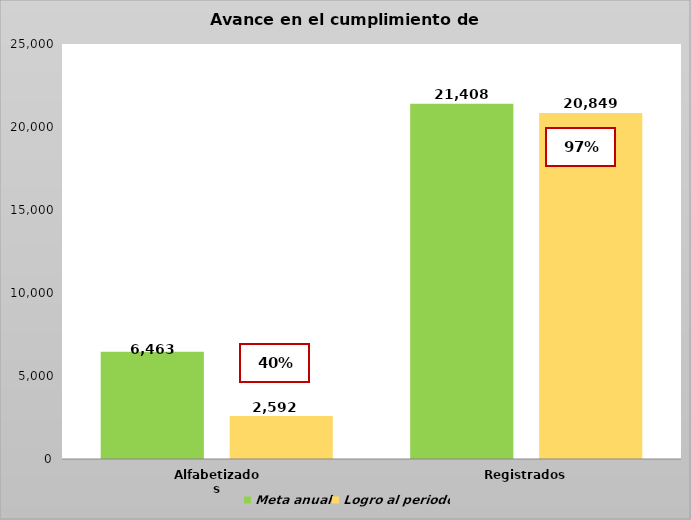
| Category | Meta anual | Logro al periodo |
|---|---|---|
| Alfabetizados | 6463 | 2592 |
| Registrados | 21408 | 20849 |